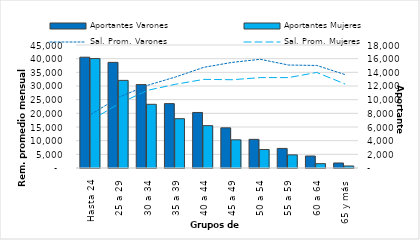
| Category | Aportantes Varones | Aportantes Mujeres |
|---|---|---|
| Hasta 24 | 16212 | 16014 |
| 25 a 29 | 15458 | 12823 |
| 30 a 34 | 12205 | 9321 |
| 35 a 39 | 9421 | 7218 |
| 40 a 44 | 8126 | 6197 |
| 45 a 49 | 5877 | 4126 |
| 50 a 54 | 4193 | 2704 |
| 55 a 59 | 2866 | 1919 |
| 60 a 64 | 1752 | 636 |
| 65 y más | 733 | 293 |